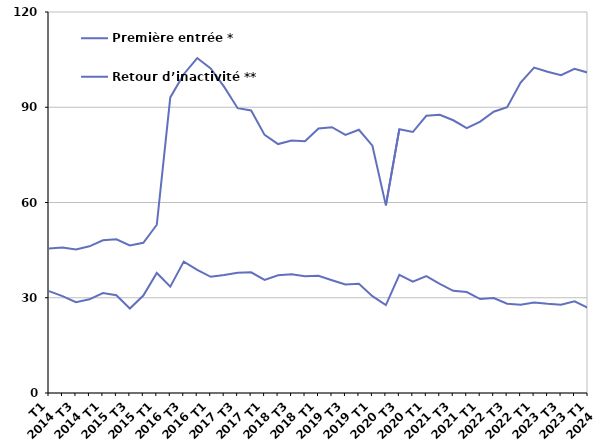
| Category | Première entrée * | Retour d’inactivité ** |
|---|---|---|
| T1
2014 | 32.1 | 45.5 |
| T2
2014 | 30.5 | 45.8 |
| T3
2014 | 28.6 | 45.2 |
| T4
2014 | 29.5 | 46.2 |
| T1
2015 | 31.5 | 48.1 |
| T2
2015 | 30.8 | 48.4 |
| T3
2015 | 26.6 | 46.5 |
| T4
2015 | 30.7 | 47.3 |
| T1
2016 | 37.8 | 53 |
| T2
2016 | 33.5 | 93.1 |
| T3
2016 | 41.4 | 100.4 |
| T4
2016 | 38.8 | 105.5 |
| T1
2017 | 36.6 | 102.2 |
| T2
2017 | 37.2 | 96.4 |
| T3
2017 | 37.9 | 89.7 |
| T4
2017 | 38 | 89 |
| T1
2018 | 35.6 | 81.3 |
| T2
2018 | 37.1 | 78.4 |
| T3
2018 | 37.4 | 79.5 |
| T4
2018 | 36.8 | 79.3 |
| T1
2019 | 36.9 | 83.3 |
| T2
2019 | 35.5 | 83.7 |
| T3
2019 | 34.2 | 81.3 |
| T4
2019 | 34.4 | 82.9 |
| T1
2020 | 30.5 | 77.9 |
| T2
2020 | 27.7 | 59.1 |
| T3
2020 | 37.2 | 83.1 |
| T4
2020 | 35.1 | 82.2 |
| T1
2021 | 36.8 | 87.3 |
| T2
2021 | 34.4 | 87.6 |
| T3
2021 | 32.2 | 85.9 |
| T4
2021 | 31.8 | 83.4 |
| T1
2022 | 29.6 | 85.5 |
| T2
2022 | 29.9 | 88.6 |
| T3
2022 | 28.1 | 90 |
| T4
2022 | 27.8 | 97.8 |
| T1
2023 | 28.5 | 102.5 |
| T2
2023 | 28.1 | 101.2 |
| T3
2023 | 27.8 | 100.1 |
| T4
2023 | 28.9 | 102.1 |
| T1
2024 | 26.8 | 100.9 |